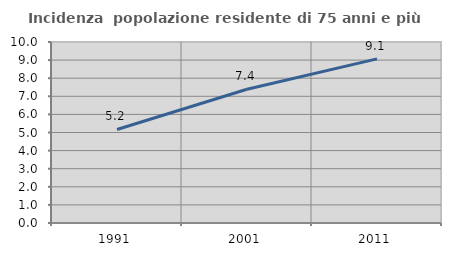
| Category | Incidenza  popolazione residente di 75 anni e più |
|---|---|
| 1991.0 | 5.167 |
| 2001.0 | 7.392 |
| 2011.0 | 9.067 |